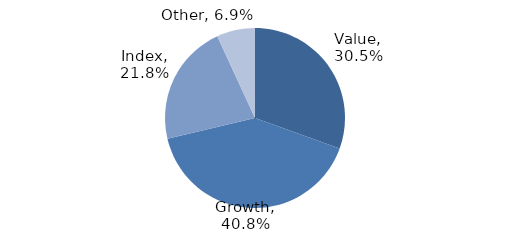
| Category | Investment Style |
|---|---|
| Value | 0.305 |
| Growth | 0.408 |
| Index | 0.218 |
| Other | 0.069 |